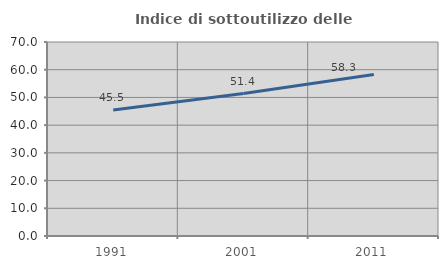
| Category | Indice di sottoutilizzo delle abitazioni  |
|---|---|
| 1991.0 | 45.455 |
| 2001.0 | 51.393 |
| 2011.0 | 58.278 |